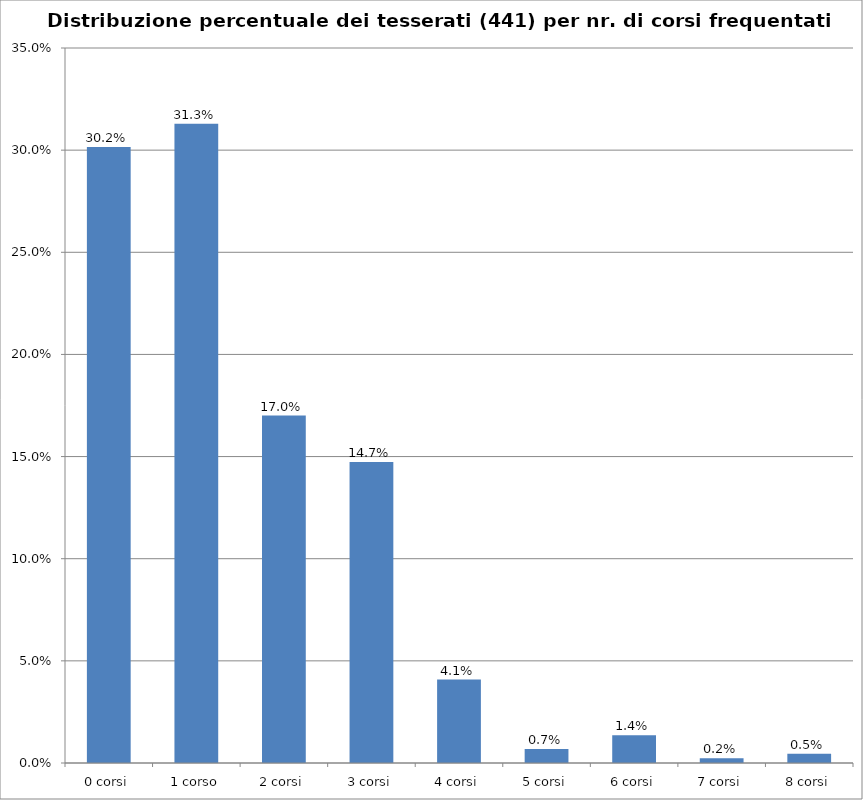
| Category | % Tesserati |
|---|---|
| 0 corsi | 0.302 |
| 1 corso | 0.313 |
| 2 corsi | 0.17 |
| 3 corsi | 0.147 |
| 4 corsi | 0.041 |
| 5 corsi | 0.007 |
| 6 corsi | 0.014 |
| 7 corsi | 0.002 |
| 8 corsi | 0.005 |